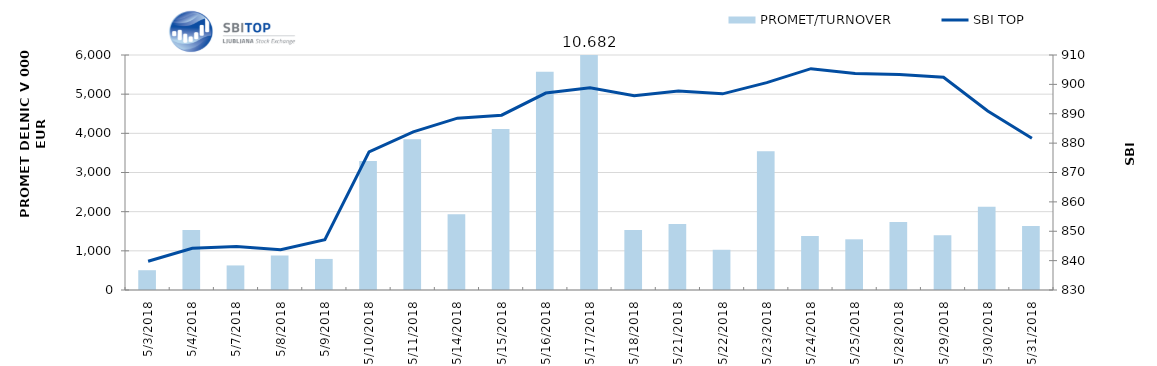
| Category | PROMET/TURNOVER |
|---|---|
| 5/3/18 | 505 |
| 5/4/18 | 1529 |
| 5/7/18 | 627 |
| 5/8/18 | 881 |
| 5/9/18 | 793 |
| 5/10/18 | 3292 |
| 5/11/18 | 3849 |
| 5/14/18 | 1934 |
| 5/15/18 | 4109 |
| 5/16/18 | 5573 |
| 5/17/18 | 10682 |
| 5/18/18 | 1533 |
| 5/21/18 | 1686 |
| 5/22/18 | 1027 |
| 5/23/18 | 3541 |
| 5/24/18 | 1376 |
| 5/25/18 | 1294 |
| 5/28/18 | 1738 |
| 5/29/18 | 1396 |
| 5/30/18 | 2123 |
| 5/31/18 | 1632 |